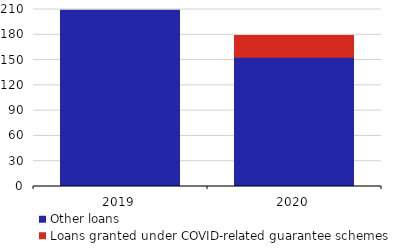
| Category | Other loans | Loans granted under COVID-related guarantee schemes |
|---|---|---|
| 2019.0 | 209.015 | 0 |
| 2020.0 | 153.4 | 25.8 |